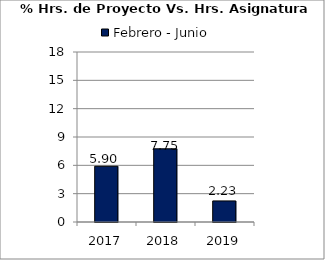
| Category | Febrero - Junio |
|---|---|
| 2017.0 | 5.9 |
| 2018.0 | 7.75 |
| 2019.0 | 2.23 |